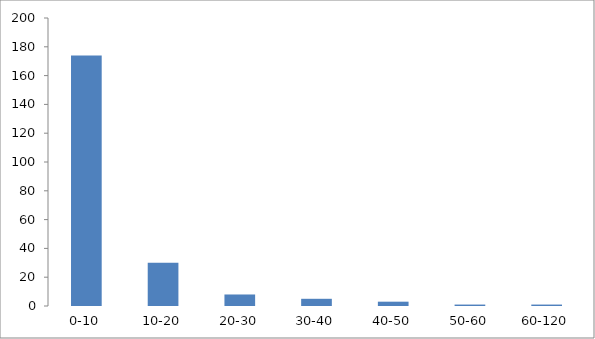
| Category | Series 0 |
|---|---|
| 0-10 | 174 |
| 10-20 | 30 |
| 20-30 | 8 |
| 30-40 | 5 |
| 40-50 | 3 |
| 50-60 | 1 |
| 60-120 | 1 |